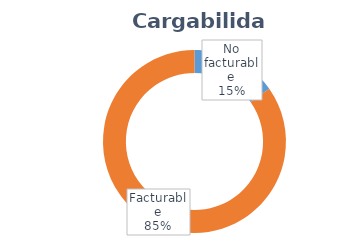
| Category | Total |
|---|---|
| No facturable | 0.152 |
| Facturable | 0.848 |